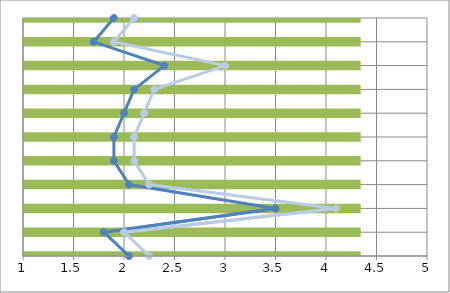
| Category | Series 2 |
|---|---|
| Fachwissen | 5 |
| Methoden | 5 |
| Sozialkompetenzen | 5 |
| Organizationsfahigkeit | 5 |
| Prasentationskompentenzen | 5 |
| Grundlagenwissen | 5 |
| Wassenschaftliche Methoden | 5 |
| Fremdsprachen | 5 |
| Wirtschaftskenntnisse | 5 |
| EDV-Kenntnisse | 5 |
| Facherubergreifendes Denken | 5 |